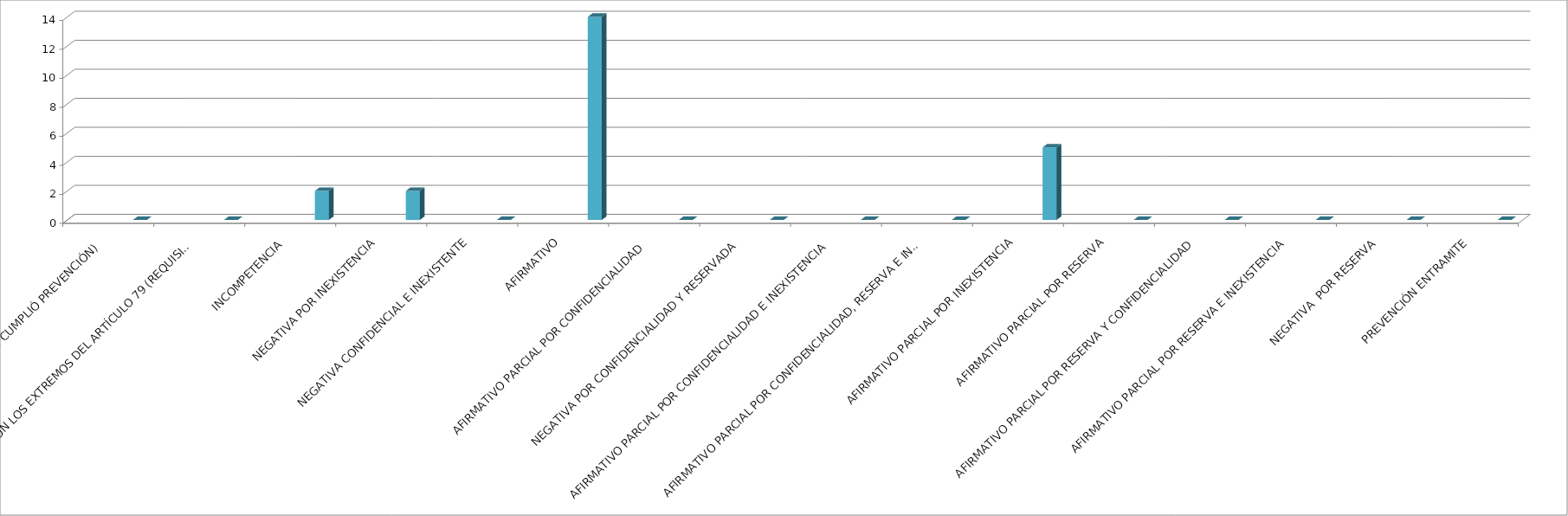
| Category | Series 0 | Series 1 | Series 2 | Series 3 | Series 4 |
|---|---|---|---|---|---|
| SE TIENE POR NO PRESENTADA ( NO CUMPLIÓ PREVENCIÓN) |  |  |  |  | 0 |
| NO CUMPLIO CON LOS EXTREMOS DEL ARTÍCULO 79 (REQUISITOS) |  |  |  |  | 0 |
| INCOMPETENCIA  |  |  |  |  | 2 |
| NEGATIVA POR INEXISTENCIA |  |  |  |  | 2 |
| NEGATIVA CONFIDENCIAL E INEXISTENTE |  |  |  |  | 0 |
| AFIRMATIVO |  |  |  |  | 14 |
| AFIRMATIVO PARCIAL POR CONFIDENCIALIDAD  |  |  |  |  | 0 |
| NEGATIVA POR CONFIDENCIALIDAD Y RESERVADA |  |  |  |  | 0 |
| AFIRMATIVO PARCIAL POR CONFIDENCIALIDAD E INEXISTENCIA |  |  |  |  | 0 |
| AFIRMATIVO PARCIAL POR CONFIDENCIALIDAD, RESERVA E INEXISTENCIA |  |  |  |  | 0 |
| AFIRMATIVO PARCIAL POR INEXISTENCIA |  |  |  |  | 5 |
| AFIRMATIVO PARCIAL POR RESERVA |  |  |  |  | 0 |
| AFIRMATIVO PARCIAL POR RESERVA Y CONFIDENCIALIDAD |  |  |  |  | 0 |
| AFIRMATIVO PARCIAL POR RESERVA E INEXISTENCIA |  |  |  |  | 0 |
| NEGATIVA  POR RESERVA |  |  |  |  | 0 |
| PREVENCIÓN ENTRAMITE |  |  |  |  | 0 |